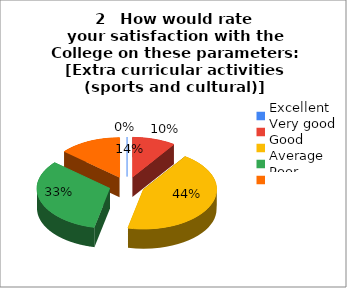
| Category | 2   How would rate
your satisfaction with the College on these parameters:                             [Extra curricular activities (sports and cultural)] |
|---|---|
| Excellent | 0 |
| Very good | 14 |
| Good | 64 |
| Average | 48 |
| Poor | 20 |